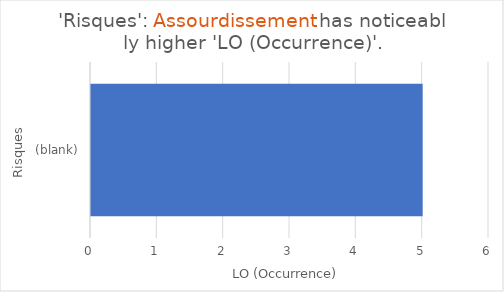
| Category | Total |
|---|---|
| (blank) | 5 |